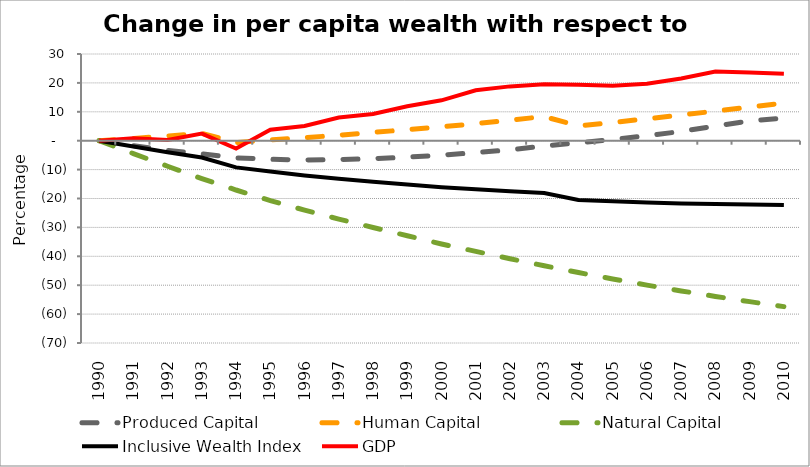
| Category | Produced Capital  | Human Capital | Natural Capital | Inclusive Wealth Index | GDP |
|---|---|---|---|---|---|
| 1990.0 | 0 | 0 | 0 | 0 | 0 |
| 1991.0 | -1.732 | 0.765 | -4.446 | -2.032 | 0.813 |
| 1992.0 | -3.321 | 1.62 | -8.849 | -3.992 | 0.262 |
| 1993.0 | -4.575 | 2.575 | -13.092 | -5.802 | 2.456 |
| 1994.0 | -5.947 | -0.65 | -17.06 | -9.231 | -2.716 |
| 1995.0 | -6.401 | 0.295 | -20.705 | -10.679 | 3.768 |
| 1996.0 | -6.718 | 1.047 | -24.035 | -12.04 | 5.086 |
| 1997.0 | -6.547 | 1.913 | -27.118 | -13.188 | 8.03 |
| 1998.0 | -6.236 | 2.855 | -30.04 | -14.212 | 9.269 |
| 1999.0 | -5.702 | 3.828 | -32.894 | -15.17 | 11.927 |
| 2000.0 | -4.989 | 4.792 | -35.73 | -16.108 | 13.978 |
| 2001.0 | -4.15 | 5.932 | -38.296 | -16.827 | 17.432 |
| 2002.0 | -3.149 | 7.119 | -40.825 | -17.494 | 18.795 |
| 2003.0 | -1.833 | 8.352 | -43.282 | -18.078 | 19.498 |
| 2004.0 | -0.722 | 5.103 | -45.632 | -20.499 | 19.345 |
| 2005.0 | 0.432 | 6.318 | -47.858 | -20.991 | 18.973 |
| 2006.0 | 1.716 | 7.591 | -49.971 | -21.392 | 19.705 |
| 2007.0 | 3.198 | 8.891 | -51.978 | -21.711 | 21.525 |
| 2008.0 | 5.07 | 10.226 | -53.883 | -21.931 | 23.906 |
| 2009.0 | 6.845 | 11.616 | -55.692 | -22.089 | 23.575 |
| 2010.0 | 7.799 | 13.058 | -57.412 | -22.254 | 23.176 |